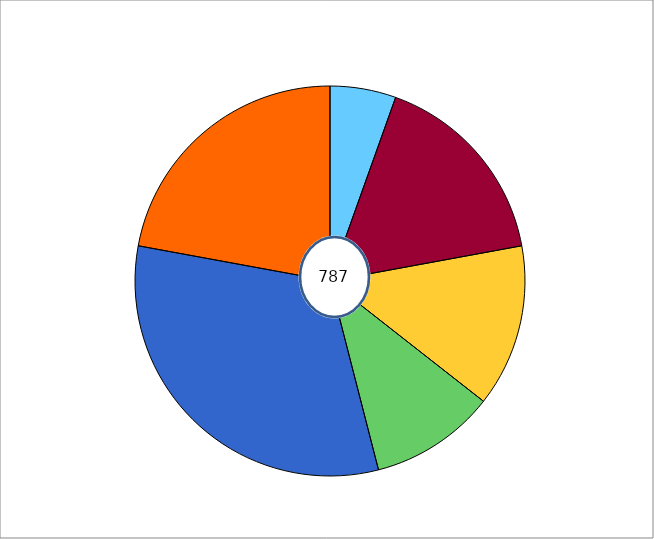
| Category | Series 1 |
|---|---|
| 0 | 43 |
| 1 | 131 |
| 2 | 106 |
| 3 | 82 |
| 4 | 251 |
| 5 | 174 |